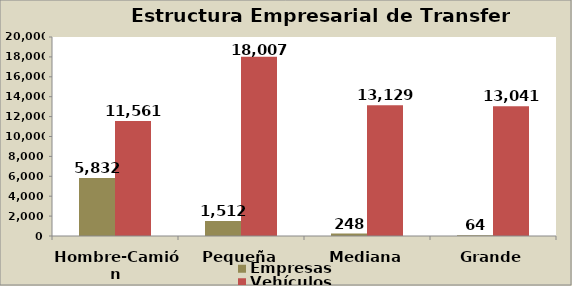
| Category | Empresas | Vehículos |
|---|---|---|
| Hombre-Camión | 5832 | 11561 |
| Pequeña | 1512 | 18007 |
| Mediana | 248 | 13129 |
| Grande | 64 | 13041 |